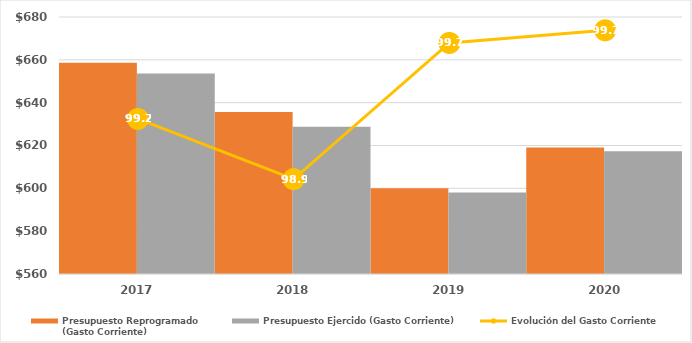
| Category | Presupuesto Reprogramado
(Gasto Corriente) | Presupuesto Ejercido (Gasto Corriente) |
|---|---|---|
| 2017.0 | 658646.191 | 653670.792 |
| 2018.0 | 635662.96 | 628777.639 |
| 2019.0 | 600084.757 | 598036.132 |
| 2020.0 | 619034.656 | 617347.742 |